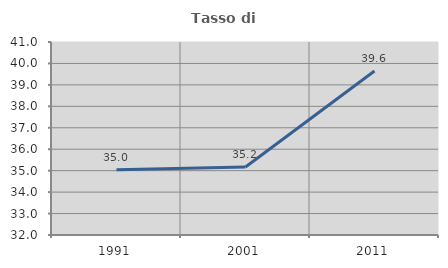
| Category | Tasso di occupazione   |
|---|---|
| 1991.0 | 35.044 |
| 2001.0 | 35.174 |
| 2011.0 | 39.649 |